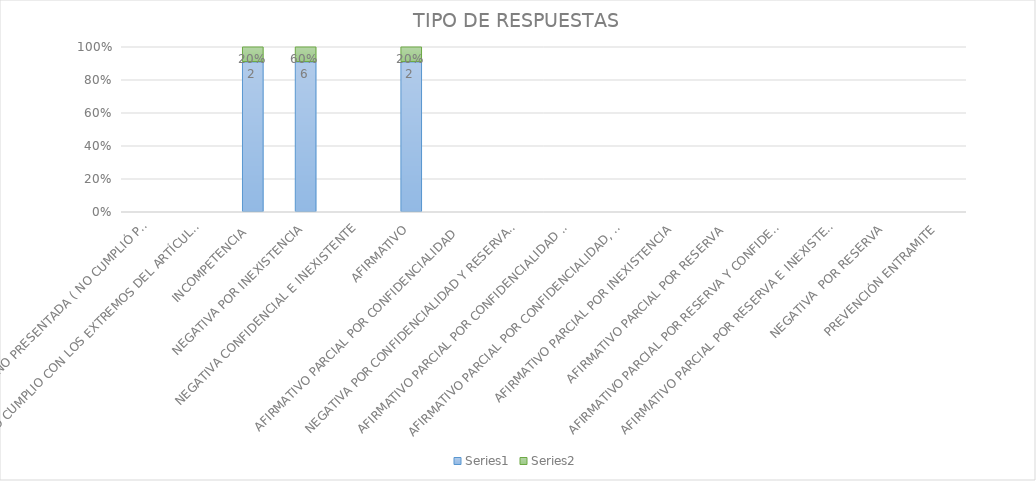
| Category | Series 4 | Series 5 |
|---|---|---|
| SE TIENE POR NO PRESENTADA ( NO CUMPLIÓ PREVENCIÓN) | 0 | 0 |
| NO CUMPLIO CON LOS EXTREMOS DEL ARTÍCULO 79 (REQUISITOS) | 0 | 0 |
| INCOMPETENCIA  | 2 | 0.2 |
| NEGATIVA POR INEXISTENCIA | 6 | 0.6 |
| NEGATIVA CONFIDENCIAL E INEXISTENTE | 0 | 0 |
| AFIRMATIVO | 2 | 0.2 |
| AFIRMATIVO PARCIAL POR CONFIDENCIALIDAD  | 0 | 0 |
| NEGATIVA POR CONFIDENCIALIDAD Y RESERVADA | 0 | 0 |
| AFIRMATIVO PARCIAL POR CONFIDENCIALIDAD E INEXISTENCIA | 0 | 0 |
| AFIRMATIVO PARCIAL POR CONFIDENCIALIDAD, RESERVA E INEXISTENCIA | 0 | 0 |
| AFIRMATIVO PARCIAL POR INEXISTENCIA | 0 | 0 |
| AFIRMATIVO PARCIAL POR RESERVA | 0 | 0 |
| AFIRMATIVO PARCIAL POR RESERVA Y CONFIDENCIALIDAD | 0 | 0 |
| AFIRMATIVO PARCIAL POR RESERVA E INEXISTENCIA | 0 | 0 |
| NEGATIVA  POR RESERVA | 0 | 0 |
| PREVENCIÓN ENTRAMITE | 0 | 0 |